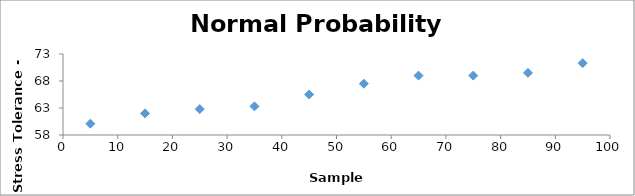
| Category | Series 0 |
|---|---|
| 5.0 | 60.1 |
| 15.0 | 62 |
| 25.0 | 62.8 |
| 35.0 | 63.3 |
| 45.0 | 65.5 |
| 55.0 | 67.5 |
| 65.0 | 69 |
| 75.0 | 69 |
| 85.0 | 69.5 |
| 95.0 | 71.3 |